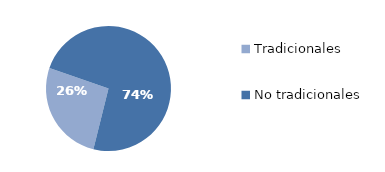
| Category | Series 0 |
|---|---|
| Tradicionales | 62.735 |
| No tradicionales | 174.869 |